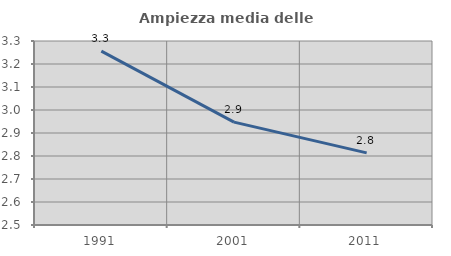
| Category | Ampiezza media delle famiglie |
|---|---|
| 1991.0 | 3.256 |
| 2001.0 | 2.947 |
| 2011.0 | 2.814 |